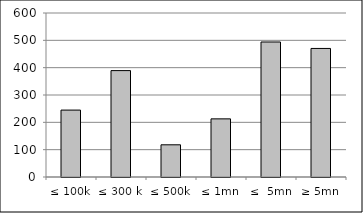
| Category | Series 0 |
|---|---|
| ≤ 100k | 244804457.372 |
| ≤ 300 k | 389243373.013 |
| ≤ 500k | 117809088.147 |
| ≤ 1mn | 212703044.958 |
| ≤  5mn | 493954338.033 |
| ≥ 5mn | 470349096.48 |